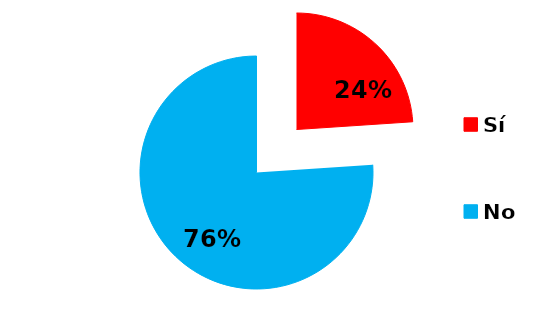
| Category | Series 0 |
|---|---|
| Sí | 34 |
| No | 108 |